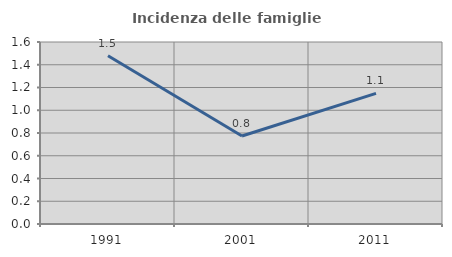
| Category | Incidenza delle famiglie numerose |
|---|---|
| 1991.0 | 1.479 |
| 2001.0 | 0.773 |
| 2011.0 | 1.149 |